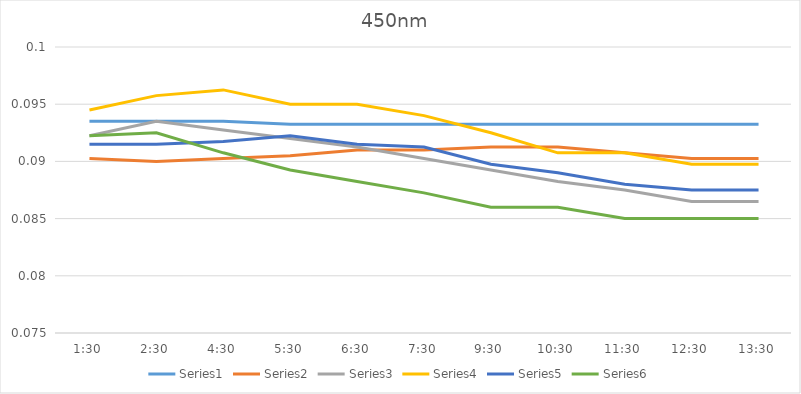
| Category | Series 0 | Series 1 | Series 2 | Series 3 | Series 4 | Series 5 |
|---|---|---|---|---|---|---|
| 0.0625 | 0.094 | 0.09 | 0.092 | 0.094 | 0.092 | 0.092 |
| 0.104166666666667 | 0.094 | 0.09 | 0.094 | 0.096 | 0.092 | 0.092 |
| 0.1875 | 0.094 | 0.09 | 0.093 | 0.096 | 0.092 | 0.091 |
| 0.229166666666667 | 0.093 | 0.09 | 0.092 | 0.095 | 0.092 | 0.089 |
| 0.270833333333333 | 0.093 | 0.091 | 0.091 | 0.095 | 0.092 | 0.088 |
| 0.3125 | 0.093 | 0.091 | 0.09 | 0.094 | 0.091 | 0.087 |
| 0.395833333333333 | 0.093 | 0.091 | 0.089 | 0.092 | 0.09 | 0.086 |
| 0.4375 | 0.093 | 0.091 | 0.088 | 0.091 | 0.089 | 0.086 |
| 0.479166666666667 | 0.093 | 0.091 | 0.088 | 0.091 | 0.088 | 0.085 |
| 0.520833333333333 | 0.093 | 0.09 | 0.086 | 0.09 | 0.088 | 0.085 |
| 0.5625 | 0.093 | 0.09 | 0.086 | 0.09 | 0.088 | 0.085 |